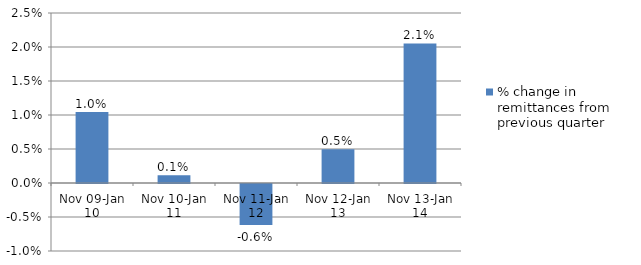
| Category | % change in remittances from previous quarter |
|---|---|
| Nov 09-Jan 10 | 0.01 |
| Nov 10-Jan 11 | 0.001 |
| Nov 11-Jan 12 | -0.006 |
| Nov 12-Jan 13 | 0.005 |
| Nov 13-Jan 14 | 0.021 |